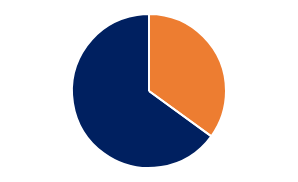
| Category | Series 1 | Series 0 |
|---|---|---|
| Time spent on PowerPoint | 0.35 | 0.35 |
| Rest of your time | 0.65 | 0.65 |